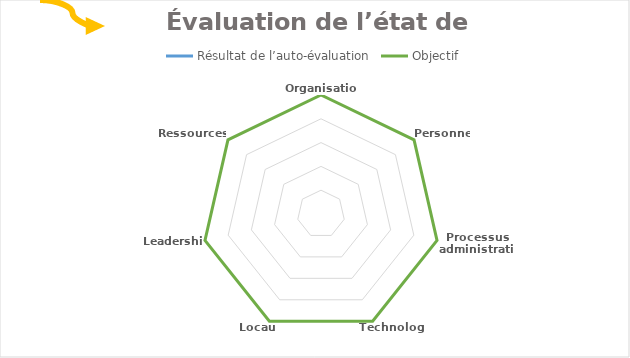
| Category | Résultat de l’auto-évaluation | Objectif |
|---|---|---|
| Organisation | 0 | 5 |
| Personnel | 0 | 5 |
| Processus administratifs | 0 | 5 |
| Technologie | 0 | 5 |
| Locaux | 0 | 5 |
| Leadership | 0 | 5 |
| Ressources  | 0 | 5 |